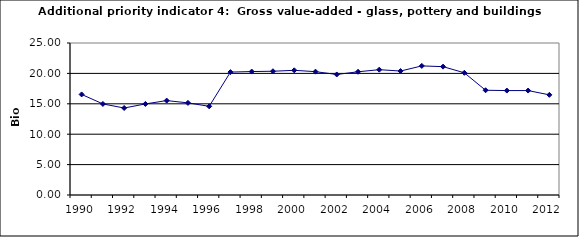
| Category | Gross value-added - glass, pottery and buildings materials industry, Bio Euro (EC95) |
|---|---|
| 1990 | 16.541 |
| 1991 | 14.978 |
| 1992 | 14.308 |
| 1993 | 14.978 |
| 1994 | 15.528 |
| 1995 | 15.15 |
| 1996 | 14.583 |
| 1997 | 20.217 |
| 1998 | 20.303 |
| 1999 | 20.355 |
| 2000 | 20.509 |
| 2001 | 20.286 |
| 2002 | 19.822 |
| 2003 | 20.269 |
| 2004 | 20.612 |
| 2005 | 20.389 |
| 2006 | 21.231 |
| 2007 | 21.11 |
| 2008 | 20.097 |
| 2009 | 17.228 |
| 2010 | 17.177 |
| 2011 | 17.177 |
| 2012 | 16.473 |